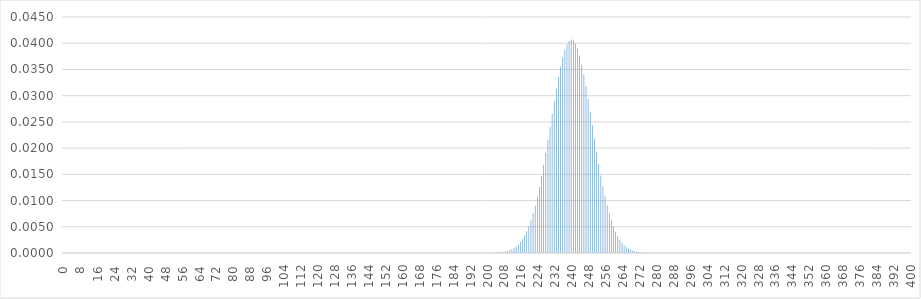
| Category | Series 0 |
|---|---|
| 0.0 | 0 |
| 1.0 | 0 |
| 2.0 | 0 |
| 3.0 | 0 |
| 4.0 | 0 |
| 5.0 | 0 |
| 6.0 | 0 |
| 7.0 | 0 |
| 8.0 | 0 |
| 9.0 | 0 |
| 10.0 | 0 |
| 11.0 | 0 |
| 12.0 | 0 |
| 13.0 | 0 |
| 14.0 | 0 |
| 15.0 | 0 |
| 16.0 | 0 |
| 17.0 | 0 |
| 18.0 | 0 |
| 19.0 | 0 |
| 20.0 | 0 |
| 21.0 | 0 |
| 22.0 | 0 |
| 23.0 | 0 |
| 24.0 | 0 |
| 25.0 | 0 |
| 26.0 | 0 |
| 27.0 | 0 |
| 28.0 | 0 |
| 29.0 | 0 |
| 30.0 | 0 |
| 31.0 | 0 |
| 32.0 | 0 |
| 33.0 | 0 |
| 34.0 | 0 |
| 35.0 | 0 |
| 36.0 | 0 |
| 37.0 | 0 |
| 38.0 | 0 |
| 39.0 | 0 |
| 40.0 | 0 |
| 41.0 | 0 |
| 42.0 | 0 |
| 43.0 | 0 |
| 44.0 | 0 |
| 45.0 | 0 |
| 46.0 | 0 |
| 47.0 | 0 |
| 48.0 | 0 |
| 49.0 | 0 |
| 50.0 | 0 |
| 51.0 | 0 |
| 52.0 | 0 |
| 53.0 | 0 |
| 54.0 | 0 |
| 55.0 | 0 |
| 56.0 | 0 |
| 57.0 | 0 |
| 58.0 | 0 |
| 59.0 | 0 |
| 60.0 | 0 |
| 61.0 | 0 |
| 62.0 | 0 |
| 63.0 | 0 |
| 64.0 | 0 |
| 65.0 | 0 |
| 66.0 | 0 |
| 67.0 | 0 |
| 68.0 | 0 |
| 69.0 | 0 |
| 70.0 | 0 |
| 71.0 | 0 |
| 72.0 | 0 |
| 73.0 | 0 |
| 74.0 | 0 |
| 75.0 | 0 |
| 76.0 | 0 |
| 77.0 | 0 |
| 78.0 | 0 |
| 79.0 | 0 |
| 80.0 | 0 |
| 81.0 | 0 |
| 82.0 | 0 |
| 83.0 | 0 |
| 84.0 | 0 |
| 85.0 | 0 |
| 86.0 | 0 |
| 87.0 | 0 |
| 88.0 | 0 |
| 89.0 | 0 |
| 90.0 | 0 |
| 91.0 | 0 |
| 92.0 | 0 |
| 93.0 | 0 |
| 94.0 | 0 |
| 95.0 | 0 |
| 96.0 | 0 |
| 97.0 | 0 |
| 98.0 | 0 |
| 99.0 | 0 |
| 100.0 | 0 |
| 101.0 | 0 |
| 102.0 | 0 |
| 103.0 | 0 |
| 104.0 | 0 |
| 105.0 | 0 |
| 106.0 | 0 |
| 107.0 | 0 |
| 108.0 | 0 |
| 109.0 | 0 |
| 110.0 | 0 |
| 111.0 | 0 |
| 112.0 | 0 |
| 113.0 | 0 |
| 114.0 | 0 |
| 115.0 | 0 |
| 116.0 | 0 |
| 117.0 | 0 |
| 118.0 | 0 |
| 119.0 | 0 |
| 120.0 | 0 |
| 121.0 | 0 |
| 122.0 | 0 |
| 123.0 | 0 |
| 124.0 | 0 |
| 125.0 | 0 |
| 126.0 | 0 |
| 127.0 | 0 |
| 128.0 | 0 |
| 129.0 | 0 |
| 130.0 | 0 |
| 131.0 | 0 |
| 132.0 | 0 |
| 133.0 | 0 |
| 134.0 | 0 |
| 135.0 | 0 |
| 136.0 | 0 |
| 137.0 | 0 |
| 138.0 | 0 |
| 139.0 | 0 |
| 140.0 | 0 |
| 141.0 | 0 |
| 142.0 | 0 |
| 143.0 | 0 |
| 144.0 | 0 |
| 145.0 | 0 |
| 146.0 | 0 |
| 147.0 | 0 |
| 148.0 | 0 |
| 149.0 | 0 |
| 150.0 | 0 |
| 151.0 | 0 |
| 152.0 | 0 |
| 153.0 | 0 |
| 154.0 | 0 |
| 155.0 | 0 |
| 156.0 | 0 |
| 157.0 | 0 |
| 158.0 | 0 |
| 159.0 | 0 |
| 160.0 | 0 |
| 161.0 | 0 |
| 162.0 | 0 |
| 163.0 | 0 |
| 164.0 | 0 |
| 165.0 | 0 |
| 166.0 | 0 |
| 167.0 | 0 |
| 168.0 | 0 |
| 169.0 | 0 |
| 170.0 | 0 |
| 171.0 | 0 |
| 172.0 | 0 |
| 173.0 | 0 |
| 174.0 | 0 |
| 175.0 | 0 |
| 176.0 | 0 |
| 177.0 | 0 |
| 178.0 | 0 |
| 179.0 | 0 |
| 180.0 | 0 |
| 181.0 | 0 |
| 182.0 | 0 |
| 183.0 | 0 |
| 184.0 | 0 |
| 185.0 | 0 |
| 186.0 | 0 |
| 187.0 | 0 |
| 188.0 | 0 |
| 189.0 | 0 |
| 190.0 | 0 |
| 191.0 | 0 |
| 192.0 | 0 |
| 193.0 | 0 |
| 194.0 | 0 |
| 195.0 | 0 |
| 196.0 | 0 |
| 197.0 | 0 |
| 198.0 | 0 |
| 199.0 | 0 |
| 200.0 | 0 |
| 201.0 | 0 |
| 202.0 | 0 |
| 203.0 | 0 |
| 204.0 | 0 |
| 205.0 | 0 |
| 206.0 | 0 |
| 207.0 | 0 |
| 208.0 | 0 |
| 209.0 | 0 |
| 210.0 | 0 |
| 211.0 | 0.001 |
| 212.0 | 0.001 |
| 213.0 | 0.001 |
| 214.0 | 0.001 |
| 215.0 | 0.002 |
| 216.0 | 0.002 |
| 217.0 | 0.003 |
| 218.0 | 0.003 |
| 219.0 | 0.004 |
| 220.0 | 0.005 |
| 221.0 | 0.006 |
| 222.0 | 0.008 |
| 223.0 | 0.009 |
| 224.0 | 0.011 |
| 225.0 | 0.013 |
| 226.0 | 0.015 |
| 227.0 | 0.017 |
| 228.0 | 0.019 |
| 229.0 | 0.022 |
| 230.0 | 0.024 |
| 231.0 | 0.027 |
| 232.0 | 0.029 |
| 233.0 | 0.031 |
| 234.0 | 0.034 |
| 235.0 | 0.036 |
| 236.0 | 0.037 |
| 237.0 | 0.039 |
| 238.0 | 0.04 |
| 239.0 | 0.04 |
| 240.0 | 0.041 |
| 241.0 | 0.041 |
| 242.0 | 0.04 |
| 243.0 | 0.039 |
| 244.0 | 0.038 |
| 245.0 | 0.036 |
| 246.0 | 0.034 |
| 247.0 | 0.032 |
| 248.0 | 0.029 |
| 249.0 | 0.027 |
| 250.0 | 0.024 |
| 251.0 | 0.022 |
| 252.0 | 0.019 |
| 253.0 | 0.017 |
| 254.0 | 0.015 |
| 255.0 | 0.013 |
| 256.0 | 0.011 |
| 257.0 | 0.009 |
| 258.0 | 0.008 |
| 259.0 | 0.006 |
| 260.0 | 0.005 |
| 261.0 | 0.004 |
| 262.0 | 0.003 |
| 263.0 | 0.003 |
| 264.0 | 0.002 |
| 265.0 | 0.002 |
| 266.0 | 0.001 |
| 267.0 | 0.001 |
| 268.0 | 0.001 |
| 269.0 | 0 |
| 270.0 | 0 |
| 271.0 | 0 |
| 272.0 | 0 |
| 273.0 | 0 |
| 274.0 | 0 |
| 275.0 | 0 |
| 276.0 | 0 |
| 277.0 | 0 |
| 278.0 | 0 |
| 279.0 | 0 |
| 280.0 | 0 |
| 281.0 | 0 |
| 282.0 | 0 |
| 283.0 | 0 |
| 284.0 | 0 |
| 285.0 | 0 |
| 286.0 | 0 |
| 287.0 | 0 |
| 288.0 | 0 |
| 289.0 | 0 |
| 290.0 | 0 |
| 291.0 | 0 |
| 292.0 | 0 |
| 293.0 | 0 |
| 294.0 | 0 |
| 295.0 | 0 |
| 296.0 | 0 |
| 297.0 | 0 |
| 298.0 | 0 |
| 299.0 | 0 |
| 300.0 | 0 |
| 301.0 | 0 |
| 302.0 | 0 |
| 303.0 | 0 |
| 304.0 | 0 |
| 305.0 | 0 |
| 306.0 | 0 |
| 307.0 | 0 |
| 308.0 | 0 |
| 309.0 | 0 |
| 310.0 | 0 |
| 311.0 | 0 |
| 312.0 | 0 |
| 313.0 | 0 |
| 314.0 | 0 |
| 315.0 | 0 |
| 316.0 | 0 |
| 317.0 | 0 |
| 318.0 | 0 |
| 319.0 | 0 |
| 320.0 | 0 |
| 321.0 | 0 |
| 322.0 | 0 |
| 323.0 | 0 |
| 324.0 | 0 |
| 325.0 | 0 |
| 326.0 | 0 |
| 327.0 | 0 |
| 328.0 | 0 |
| 329.0 | 0 |
| 330.0 | 0 |
| 331.0 | 0 |
| 332.0 | 0 |
| 333.0 | 0 |
| 334.0 | 0 |
| 335.0 | 0 |
| 336.0 | 0 |
| 337.0 | 0 |
| 338.0 | 0 |
| 339.0 | 0 |
| 340.0 | 0 |
| 341.0 | 0 |
| 342.0 | 0 |
| 343.0 | 0 |
| 344.0 | 0 |
| 345.0 | 0 |
| 346.0 | 0 |
| 347.0 | 0 |
| 348.0 | 0 |
| 349.0 | 0 |
| 350.0 | 0 |
| 351.0 | 0 |
| 352.0 | 0 |
| 353.0 | 0 |
| 354.0 | 0 |
| 355.0 | 0 |
| 356.0 | 0 |
| 357.0 | 0 |
| 358.0 | 0 |
| 359.0 | 0 |
| 360.0 | 0 |
| 361.0 | 0 |
| 362.0 | 0 |
| 363.0 | 0 |
| 364.0 | 0 |
| 365.0 | 0 |
| 366.0 | 0 |
| 367.0 | 0 |
| 368.0 | 0 |
| 369.0 | 0 |
| 370.0 | 0 |
| 371.0 | 0 |
| 372.0 | 0 |
| 373.0 | 0 |
| 374.0 | 0 |
| 375.0 | 0 |
| 376.0 | 0 |
| 377.0 | 0 |
| 378.0 | 0 |
| 379.0 | 0 |
| 380.0 | 0 |
| 381.0 | 0 |
| 382.0 | 0 |
| 383.0 | 0 |
| 384.0 | 0 |
| 385.0 | 0 |
| 386.0 | 0 |
| 387.0 | 0 |
| 388.0 | 0 |
| 389.0 | 0 |
| 390.0 | 0 |
| 391.0 | 0 |
| 392.0 | 0 |
| 393.0 | 0 |
| 394.0 | 0 |
| 395.0 | 0 |
| 396.0 | 0 |
| 397.0 | 0 |
| 398.0 | 0 |
| 399.0 | 0 |
| 400.0 | 0 |